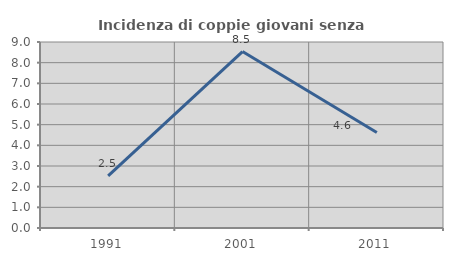
| Category | Incidenza di coppie giovani senza figli |
|---|---|
| 1991.0 | 2.518 |
| 2001.0 | 8.537 |
| 2011.0 | 4.62 |